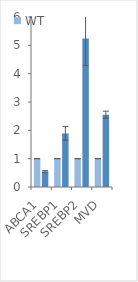
| Category | WT | FDX1-Het |
|---|---|---|
| ABCA1 | 1 | 0.547 |
| SREBP1 | 1 | 1.893 |
| SREBP2 | 1 | 5.244 |
| MVD | 1 | 2.551 |